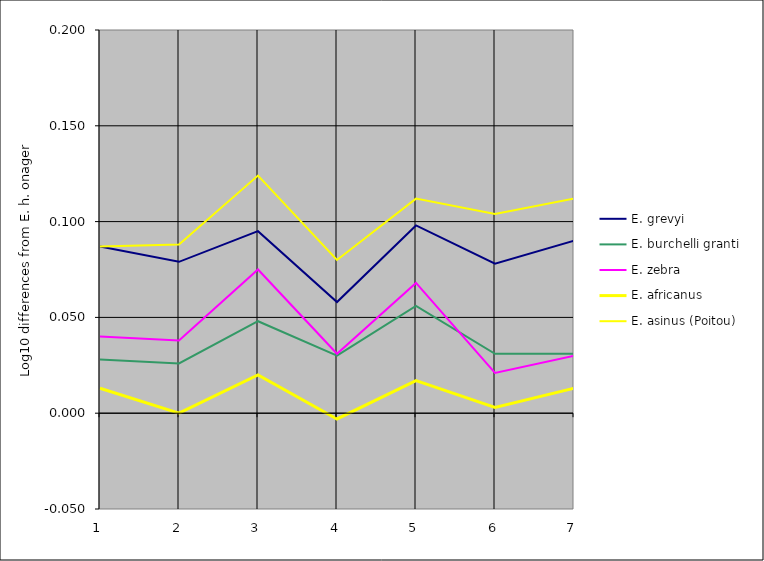
| Category | E. grevyi | E. burchelli granti | E. zebra | E. africanus | E. asinus (Poitou)  |
|---|---|---|---|---|---|
| 1.0 | 0.087 | 0.028 | 0.04 | 0.013 | 0.087 |
| 2.0 | 0.079 | 0.026 | 0.038 | 0 | 0.088 |
| 3.0 | 0.095 | 0.048 | 0.075 | 0.02 | 0.124 |
| 4.0 | 0.058 | 0.03 | 0.031 | -0.003 | 0.08 |
| 5.0 | 0.098 | 0.056 | 0.068 | 0.017 | 0.112 |
| 6.0 | 0.078 | 0.031 | 0.021 | 0.003 | 0.104 |
| 7.0 | 0.09 | 0.031 | 0.03 | 0.013 | 0.112 |